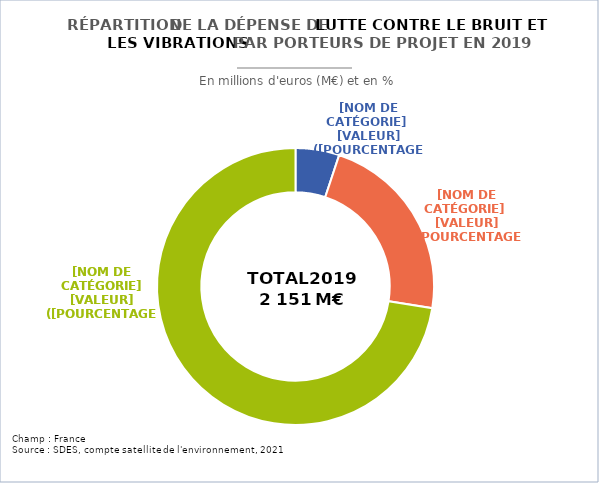
| Category | Series 0 |
|---|---|
| Administrations publiques centrales | 0 |
| Administrations publiques locales | 109.877 |
| Entreprises | 481.77 |
| Ménages | 1559.492 |